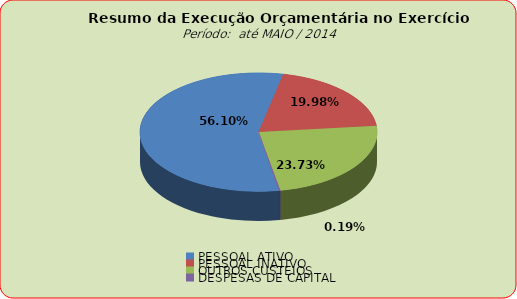
| Category | Series 0 |
|---|---|
| PESSOAL ATIVO | 47016771.06 |
| PESSOAL INATIVO | 16743840.76 |
| OUTROS CUSTEIOS | 19885716.96 |
| DESPESAS DE CAPITAL | 156231.57 |